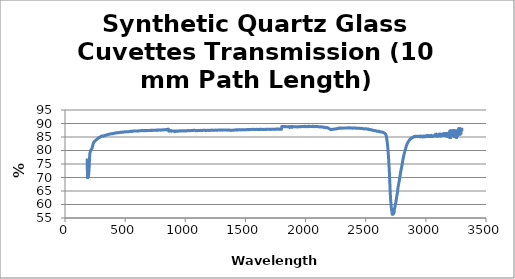
| Category | % Transmission |
|---|---|
| 184.0 | 77.01 |
| 186.0 | 72.795 |
| 188.0 | 69.584 |
| 190.0 | 70.28 |
| 192.0 | 70.039 |
| 194.0 | 70.346 |
| 196.0 | 70.833 |
| 198.0 | 71.847 |
| 200.0 | 72.99 |
| 202.0 | 75.142 |
| 204.0 | 77.218 |
| 206.0 | 78.444 |
| 208.0 | 79.222 |
| 210.0 | 79.507 |
| 212.0 | 79.833 |
| 214.0 | 80.123 |
| 216.0 | 80.232 |
| 218.0 | 80.391 |
| 220.0 | 80.437 |
| 222.0 | 80.59 |
| 224.0 | 80.714 |
| 226.0 | 81.015 |
| 228.0 | 81.384 |
| 230.0 | 81.783 |
| 232.0 | 82.081 |
| 234.0 | 82.448 |
| 236.0 | 82.708 |
| 238.0 | 82.932 |
| 240.0 | 83.122 |
| 242.0 | 83.207 |
| 244.0 | 83.247 |
| 246.0 | 83.444 |
| 248.0 | 83.463 |
| 250.0 | 83.513 |
| 252.0 | 83.63 |
| 254.0 | 83.703 |
| 256.0 | 83.775 |
| 258.0 | 83.917 |
| 260.0 | 83.956 |
| 262.0 | 84.018 |
| 264.0 | 84.085 |
| 266.0 | 84.125 |
| 268.0 | 84.292 |
| 270.0 | 84.31 |
| 272.0 | 84.421 |
| 274.0 | 84.506 |
| 276.0 | 84.494 |
| 278.0 | 84.618 |
| 280.0 | 84.727 |
| 282.0 | 84.783 |
| 284.0 | 84.761 |
| 286.0 | 84.79 |
| 288.0 | 84.826 |
| 290.0 | 84.905 |
| 292.0 | 84.96 |
| 294.0 | 85.03 |
| 296.0 | 85.107 |
| 298.0 | 85.185 |
| 300.0 | 85.177 |
| 302.0 | 85.249 |
| 304.0 | 85.359 |
| 306.0 | 85.329 |
| 308.0 | 85.391 |
| 310.0 | 85.413 |
| 312.0 | 85.385 |
| 314.0 | 85.388 |
| 316.0 | 85.379 |
| 318.0 | 85.413 |
| 320.0 | 85.373 |
| 322.0 | 85.417 |
| 324.0 | 85.411 |
| 326.0 | 85.448 |
| 328.0 | 85.521 |
| 330.0 | 85.534 |
| 332.0 | 85.519 |
| 334.0 | 85.555 |
| 336.0 | 85.603 |
| 338.0 | 85.638 |
| 340.0 | 85.689 |
| 342.0 | 85.733 |
| 344.0 | 85.711 |
| 346.0 | 85.727 |
| 348.0 | 85.74 |
| 350.0 | 85.793 |
| 352.0 | 85.847 |
| 354.0 | 85.887 |
| 356.0 | 85.906 |
| 358.0 | 85.941 |
| 360.0 | 85.958 |
| 362.0 | 85.958 |
| 364.0 | 86 |
| 366.0 | 86.009 |
| 368.0 | 86.025 |
| 370.0 | 86.064 |
| 372.0 | 86.105 |
| 374.0 | 86.102 |
| 376.0 | 86.094 |
| 378.0 | 86.125 |
| 380.0 | 86.155 |
| 382.0 | 86.229 |
| 384.0 | 86.197 |
| 386.0 | 86.145 |
| 388.0 | 86.191 |
| 390.0 | 86.193 |
| 392.0 | 86.206 |
| 394.0 | 86.218 |
| 396.0 | 86.262 |
| 398.0 | 86.307 |
| 400.0 | 86.31 |
| 402.0 | 86.312 |
| 404.0 | 86.304 |
| 406.0 | 86.327 |
| 408.0 | 86.346 |
| 410.0 | 86.379 |
| 412.0 | 86.389 |
| 414.0 | 86.456 |
| 416.0 | 86.529 |
| 418.0 | 86.506 |
| 420.0 | 86.477 |
| 422.0 | 86.49 |
| 424.0 | 86.526 |
| 426.0 | 86.516 |
| 428.0 | 86.542 |
| 430.0 | 86.591 |
| 432.0 | 86.604 |
| 434.0 | 86.586 |
| 436.0 | 86.609 |
| 438.0 | 86.629 |
| 440.0 | 86.62 |
| 442.0 | 86.611 |
| 444.0 | 86.591 |
| 446.0 | 86.6 |
| 448.0 | 86.637 |
| 450.0 | 86.652 |
| 452.0 | 86.668 |
| 454.0 | 86.704 |
| 456.0 | 86.706 |
| 458.0 | 86.736 |
| 460.0 | 86.73 |
| 462.0 | 86.724 |
| 464.0 | 86.711 |
| 466.0 | 86.675 |
| 468.0 | 86.709 |
| 470.0 | 86.742 |
| 472.0 | 86.747 |
| 474.0 | 86.792 |
| 476.0 | 86.811 |
| 478.0 | 86.786 |
| 480.0 | 86.781 |
| 482.0 | 86.776 |
| 484.0 | 86.812 |
| 486.0 | 86.878 |
| 488.0 | 86.893 |
| 490.0 | 86.871 |
| 492.0 | 86.892 |
| 494.0 | 86.918 |
| 496.0 | 86.925 |
| 498.0 | 86.934 |
| 500.0 | 86.923 |
| 502.0 | 86.902 |
| 504.0 | 86.887 |
| 506.0 | 86.928 |
| 508.0 | 86.903 |
| 510.0 | 86.904 |
| 512.0 | 86.931 |
| 514.0 | 86.898 |
| 516.0 | 86.936 |
| 518.0 | 86.952 |
| 520.0 | 86.933 |
| 522.0 | 86.957 |
| 524.0 | 86.953 |
| 526.0 | 86.926 |
| 528.0 | 86.948 |
| 530.0 | 86.984 |
| 532.0 | 86.991 |
| 534.0 | 87.01 |
| 536.0 | 87.052 |
| 538.0 | 87.064 |
| 540.0 | 87.053 |
| 542.0 | 87.086 |
| 544.0 | 87.09 |
| 546.0 | 87.088 |
| 548.0 | 87.091 |
| 550.0 | 87.065 |
| 552.0 | 87.043 |
| 554.0 | 87.062 |
| 556.0 | 87.042 |
| 558.0 | 87.073 |
| 560.0 | 87.161 |
| 562.0 | 87.198 |
| 564.0 | 87.179 |
| 566.0 | 87.195 |
| 568.0 | 87.183 |
| 570.0 | 87.171 |
| 572.0 | 87.208 |
| 574.0 | 87.206 |
| 576.0 | 87.223 |
| 578.0 | 87.174 |
| 580.0 | 87.197 |
| 582.0 | 87.231 |
| 584.0 | 87.228 |
| 586.0 | 87.208 |
| 588.0 | 87.24 |
| 590.0 | 87.269 |
| 592.0 | 87.221 |
| 594.0 | 87.202 |
| 596.0 | 87.23 |
| 598.0 | 87.229 |
| 600.0 | 87.23 |
| 602.0 | 87.237 |
| 604.0 | 87.165 |
| 606.0 | 87.185 |
| 608.0 | 87.267 |
| 610.0 | 87.277 |
| 612.0 | 87.254 |
| 614.0 | 87.262 |
| 616.0 | 87.254 |
| 618.0 | 87.299 |
| 620.0 | 87.319 |
| 622.0 | 87.293 |
| 624.0 | 87.316 |
| 626.0 | 87.311 |
| 628.0 | 87.273 |
| 630.0 | 87.274 |
| 632.0 | 87.276 |
| 634.0 | 87.364 |
| 636.0 | 87.39 |
| 638.0 | 87.373 |
| 640.0 | 87.406 |
| 642.0 | 87.419 |
| 644.0 | 87.375 |
| 646.0 | 87.381 |
| 648.0 | 87.372 |
| 650.0 | 87.344 |
| 652.0 | 87.368 |
| 654.0 | 87.335 |
| 656.0 | 87.323 |
| 658.0 | 87.354 |
| 660.0 | 87.405 |
| 662.0 | 87.345 |
| 664.0 | 87.321 |
| 666.0 | 87.306 |
| 668.0 | 87.293 |
| 670.0 | 87.41 |
| 672.0 | 87.415 |
| 674.0 | 87.428 |
| 676.0 | 87.421 |
| 678.0 | 87.386 |
| 680.0 | 87.401 |
| 682.0 | 87.319 |
| 684.0 | 87.397 |
| 686.0 | 87.408 |
| 688.0 | 87.368 |
| 690.0 | 87.369 |
| 692.0 | 87.417 |
| 694.0 | 87.38 |
| 696.0 | 87.402 |
| 698.0 | 87.392 |
| 700.0 | 87.38 |
| 702.0 | 87.423 |
| 704.0 | 87.394 |
| 706.0 | 87.409 |
| 708.0 | 87.47 |
| 710.0 | 87.465 |
| 712.0 | 87.424 |
| 714.0 | 87.503 |
| 716.0 | 87.532 |
| 718.0 | 87.437 |
| 720.0 | 87.475 |
| 722.0 | 87.509 |
| 724.0 | 87.431 |
| 726.0 | 87.447 |
| 728.0 | 87.487 |
| 730.0 | 87.523 |
| 732.0 | 87.459 |
| 734.0 | 87.455 |
| 736.0 | 87.499 |
| 738.0 | 87.486 |
| 740.0 | 87.518 |
| 742.0 | 87.507 |
| 744.0 | 87.454 |
| 746.0 | 87.494 |
| 748.0 | 87.536 |
| 750.0 | 87.521 |
| 752.0 | 87.483 |
| 754.0 | 87.532 |
| 756.0 | 87.436 |
| 758.0 | 87.537 |
| 760.0 | 87.619 |
| 762.0 | 87.586 |
| 764.0 | 87.534 |
| 766.0 | 87.567 |
| 768.0 | 87.486 |
| 770.0 | 87.536 |
| 772.0 | 87.448 |
| 774.0 | 87.485 |
| 776.0 | 87.604 |
| 778.0 | 87.601 |
| 780.0 | 87.66 |
| 782.0 | 87.61 |
| 784.0 | 87.59 |
| 786.0 | 87.573 |
| 788.0 | 87.567 |
| 790.0 | 87.63 |
| 792.0 | 87.626 |
| 794.0 | 87.509 |
| 796.0 | 87.585 |
| 798.0 | 87.619 |
| 800.0 | 87.598 |
| 802.0 | 87.57 |
| 804.0 | 87.61 |
| 806.0 | 87.582 |
| 808.0 | 87.646 |
| 810.0 | 87.651 |
| 812.0 | 87.639 |
| 814.0 | 87.574 |
| 816.0 | 87.586 |
| 818.0 | 87.639 |
| 820.0 | 87.666 |
| 822.0 | 87.663 |
| 824.0 | 87.677 |
| 826.0 | 87.666 |
| 828.0 | 87.698 |
| 830.0 | 87.689 |
| 832.0 | 87.674 |
| 834.0 | 87.736 |
| 836.0 | 87.666 |
| 838.0 | 87.72 |
| 840.0 | 87.707 |
| 842.0 | 87.7 |
| 844.0 | 87.792 |
| 846.0 | 87.618 |
| 848.0 | 87.726 |
| 850.0 | 87.697 |
| 852.0 | 87.865 |
| 854.0 | 87.683 |
| 856.0 | 87.596 |
| 858.0 | 87.719 |
| 860.0 | 87.909 |
| 862.0 | 87.206 |
| 864.0 | 87.171 |
| 866.0 | 87.149 |
| 868.0 | 87.265 |
| 870.0 | 87.324 |
| 872.0 | 87.271 |
| 874.0 | 87.447 |
| 876.0 | 87.326 |
| 878.0 | 87.282 |
| 880.0 | 87.416 |
| 882.0 | 87.345 |
| 884.0 | 87.171 |
| 886.0 | 87.134 |
| 888.0 | 87.275 |
| 890.0 | 87.259 |
| 892.0 | 87.206 |
| 894.0 | 87.214 |
| 896.0 | 87.214 |
| 898.0 | 87.252 |
| 900.0 | 87.187 |
| 902.0 | 87.243 |
| 904.0 | 87.25 |
| 906.0 | 87.129 |
| 908.0 | 87.049 |
| 910.0 | 87.143 |
| 912.0 | 87.129 |
| 914.0 | 87.016 |
| 916.0 | 87.126 |
| 918.0 | 87.217 |
| 920.0 | 87.195 |
| 922.0 | 87.226 |
| 924.0 | 87.255 |
| 926.0 | 87.203 |
| 928.0 | 87.099 |
| 930.0 | 87.208 |
| 932.0 | 87.243 |
| 934.0 | 87.204 |
| 936.0 | 87.146 |
| 938.0 | 87.118 |
| 940.0 | 87.156 |
| 942.0 | 87.188 |
| 944.0 | 87.248 |
| 946.0 | 87.22 |
| 948.0 | 87.21 |
| 950.0 | 87.246 |
| 952.0 | 87.271 |
| 954.0 | 87.309 |
| 956.0 | 87.269 |
| 958.0 | 87.268 |
| 960.0 | 87.28 |
| 962.0 | 87.245 |
| 964.0 | 87.204 |
| 966.0 | 87.203 |
| 968.0 | 87.221 |
| 970.0 | 87.232 |
| 972.0 | 87.291 |
| 974.0 | 87.296 |
| 976.0 | 87.308 |
| 978.0 | 87.317 |
| 980.0 | 87.316 |
| 982.0 | 87.304 |
| 984.0 | 87.263 |
| 986.0 | 87.294 |
| 988.0 | 87.293 |
| 990.0 | 87.226 |
| 992.0 | 87.229 |
| 994.0 | 87.267 |
| 996.0 | 87.284 |
| 998.0 | 87.307 |
| 1000.0 | 87.322 |
| 1002.0 | 87.306 |
| 1004.0 | 87.256 |
| 1006.0 | 87.282 |
| 1008.0 | 87.332 |
| 1010.0 | 87.292 |
| 1012.0 | 87.263 |
| 1014.0 | 87.309 |
| 1016.0 | 87.348 |
| 1018.0 | 87.326 |
| 1020.0 | 87.337 |
| 1022.0 | 87.368 |
| 1024.0 | 87.403 |
| 1026.0 | 87.387 |
| 1028.0 | 87.348 |
| 1030.0 | 87.367 |
| 1032.0 | 87.335 |
| 1034.0 | 87.317 |
| 1036.0 | 87.331 |
| 1038.0 | 87.337 |
| 1040.0 | 87.334 |
| 1042.0 | 87.348 |
| 1044.0 | 87.393 |
| 1046.0 | 87.397 |
| 1048.0 | 87.41 |
| 1050.0 | 87.408 |
| 1052.0 | 87.374 |
| 1054.0 | 87.366 |
| 1056.0 | 87.401 |
| 1058.0 | 87.428 |
| 1060.0 | 87.423 |
| 1062.0 | 87.422 |
| 1064.0 | 87.431 |
| 1066.0 | 87.469 |
| 1068.0 | 87.513 |
| 1070.0 | 87.492 |
| 1072.0 | 87.45 |
| 1074.0 | 87.465 |
| 1076.0 | 87.506 |
| 1078.0 | 87.468 |
| 1080.0 | 87.431 |
| 1082.0 | 87.444 |
| 1084.0 | 87.388 |
| 1086.0 | 87.331 |
| 1088.0 | 87.379 |
| 1090.0 | 87.412 |
| 1092.0 | 87.382 |
| 1094.0 | 87.37 |
| 1096.0 | 87.367 |
| 1098.0 | 87.334 |
| 1100.0 | 87.322 |
| 1102.0 | 87.334 |
| 1104.0 | 87.363 |
| 1106.0 | 87.406 |
| 1108.0 | 87.416 |
| 1110.0 | 87.439 |
| 1112.0 | 87.41 |
| 1114.0 | 87.403 |
| 1116.0 | 87.428 |
| 1118.0 | 87.409 |
| 1120.0 | 87.417 |
| 1122.0 | 87.429 |
| 1124.0 | 87.481 |
| 1126.0 | 87.471 |
| 1128.0 | 87.441 |
| 1130.0 | 87.431 |
| 1132.0 | 87.445 |
| 1134.0 | 87.427 |
| 1136.0 | 87.404 |
| 1138.0 | 87.391 |
| 1140.0 | 87.396 |
| 1142.0 | 87.395 |
| 1144.0 | 87.442 |
| 1146.0 | 87.487 |
| 1148.0 | 87.471 |
| 1150.0 | 87.461 |
| 1152.0 | 87.485 |
| 1154.0 | 87.488 |
| 1156.0 | 87.497 |
| 1158.0 | 87.509 |
| 1160.0 | 87.533 |
| 1162.0 | 87.519 |
| 1164.0 | 87.504 |
| 1166.0 | 87.48 |
| 1168.0 | 87.423 |
| 1170.0 | 87.447 |
| 1172.0 | 87.427 |
| 1174.0 | 87.394 |
| 1176.0 | 87.411 |
| 1178.0 | 87.434 |
| 1180.0 | 87.459 |
| 1182.0 | 87.484 |
| 1184.0 | 87.517 |
| 1186.0 | 87.514 |
| 1188.0 | 87.452 |
| 1190.0 | 87.459 |
| 1192.0 | 87.463 |
| 1194.0 | 87.436 |
| 1196.0 | 87.44 |
| 1198.0 | 87.448 |
| 1200.0 | 87.44 |
| 1202.0 | 87.452 |
| 1204.0 | 87.508 |
| 1206.0 | 87.52 |
| 1208.0 | 87.452 |
| 1210.0 | 87.466 |
| 1212.0 | 87.489 |
| 1214.0 | 87.484 |
| 1216.0 | 87.483 |
| 1218.0 | 87.484 |
| 1220.0 | 87.523 |
| 1222.0 | 87.592 |
| 1224.0 | 87.557 |
| 1226.0 | 87.531 |
| 1228.0 | 87.527 |
| 1230.0 | 87.545 |
| 1232.0 | 87.512 |
| 1234.0 | 87.524 |
| 1236.0 | 87.548 |
| 1238.0 | 87.505 |
| 1240.0 | 87.472 |
| 1242.0 | 87.488 |
| 1244.0 | 87.498 |
| 1246.0 | 87.495 |
| 1248.0 | 87.518 |
| 1250.0 | 87.548 |
| 1252.0 | 87.569 |
| 1254.0 | 87.564 |
| 1256.0 | 87.532 |
| 1258.0 | 87.552 |
| 1260.0 | 87.545 |
| 1262.0 | 87.529 |
| 1264.0 | 87.512 |
| 1266.0 | 87.514 |
| 1268.0 | 87.509 |
| 1270.0 | 87.552 |
| 1272.0 | 87.577 |
| 1274.0 | 87.577 |
| 1276.0 | 87.584 |
| 1278.0 | 87.602 |
| 1280.0 | 87.641 |
| 1282.0 | 87.588 |
| 1284.0 | 87.572 |
| 1286.0 | 87.587 |
| 1288.0 | 87.543 |
| 1290.0 | 87.54 |
| 1292.0 | 87.569 |
| 1294.0 | 87.552 |
| 1296.0 | 87.568 |
| 1298.0 | 87.592 |
| 1300.0 | 87.565 |
| 1302.0 | 87.568 |
| 1304.0 | 87.549 |
| 1306.0 | 87.552 |
| 1308.0 | 87.523 |
| 1310.0 | 87.533 |
| 1312.0 | 87.562 |
| 1314.0 | 87.63 |
| 1316.0 | 87.617 |
| 1318.0 | 87.597 |
| 1320.0 | 87.577 |
| 1322.0 | 87.545 |
| 1324.0 | 87.569 |
| 1326.0 | 87.609 |
| 1328.0 | 87.578 |
| 1330.0 | 87.589 |
| 1332.0 | 87.616 |
| 1334.0 | 87.629 |
| 1336.0 | 87.604 |
| 1338.0 | 87.57 |
| 1340.0 | 87.581 |
| 1342.0 | 87.578 |
| 1344.0 | 87.589 |
| 1346.0 | 87.59 |
| 1348.0 | 87.548 |
| 1350.0 | 87.55 |
| 1352.0 | 87.528 |
| 1354.0 | 87.558 |
| 1356.0 | 87.575 |
| 1358.0 | 87.627 |
| 1360.0 | 87.611 |
| 1362.0 | 87.585 |
| 1364.0 | 87.581 |
| 1366.0 | 87.521 |
| 1368.0 | 87.543 |
| 1370.0 | 87.556 |
| 1372.0 | 87.513 |
| 1374.0 | 87.498 |
| 1376.0 | 87.461 |
| 1378.0 | 87.474 |
| 1380.0 | 87.445 |
| 1382.0 | 87.448 |
| 1384.0 | 87.499 |
| 1386.0 | 87.457 |
| 1388.0 | 87.465 |
| 1390.0 | 87.466 |
| 1392.0 | 87.462 |
| 1394.0 | 87.472 |
| 1396.0 | 87.503 |
| 1398.0 | 87.515 |
| 1400.0 | 87.549 |
| 1402.0 | 87.515 |
| 1404.0 | 87.548 |
| 1406.0 | 87.544 |
| 1408.0 | 87.568 |
| 1410.0 | 87.572 |
| 1412.0 | 87.587 |
| 1414.0 | 87.591 |
| 1416.0 | 87.578 |
| 1418.0 | 87.567 |
| 1420.0 | 87.592 |
| 1422.0 | 87.646 |
| 1424.0 | 87.671 |
| 1426.0 | 87.619 |
| 1428.0 | 87.621 |
| 1430.0 | 87.642 |
| 1432.0 | 87.642 |
| 1434.0 | 87.629 |
| 1436.0 | 87.647 |
| 1438.0 | 87.628 |
| 1440.0 | 87.635 |
| 1442.0 | 87.634 |
| 1444.0 | 87.672 |
| 1446.0 | 87.685 |
| 1448.0 | 87.736 |
| 1450.0 | 87.735 |
| 1452.0 | 87.679 |
| 1454.0 | 87.686 |
| 1456.0 | 87.708 |
| 1458.0 | 87.648 |
| 1460.0 | 87.614 |
| 1462.0 | 87.615 |
| 1464.0 | 87.652 |
| 1466.0 | 87.652 |
| 1468.0 | 87.665 |
| 1470.0 | 87.684 |
| 1472.0 | 87.676 |
| 1474.0 | 87.688 |
| 1476.0 | 87.682 |
| 1478.0 | 87.682 |
| 1480.0 | 87.685 |
| 1482.0 | 87.664 |
| 1484.0 | 87.65 |
| 1486.0 | 87.679 |
| 1488.0 | 87.678 |
| 1490.0 | 87.677 |
| 1492.0 | 87.717 |
| 1494.0 | 87.666 |
| 1496.0 | 87.678 |
| 1498.0 | 87.675 |
| 1500.0 | 87.659 |
| 1502.0 | 87.722 |
| 1504.0 | 87.718 |
| 1506.0 | 87.687 |
| 1508.0 | 87.698 |
| 1510.0 | 87.734 |
| 1512.0 | 87.749 |
| 1514.0 | 87.74 |
| 1516.0 | 87.734 |
| 1518.0 | 87.76 |
| 1520.0 | 87.795 |
| 1522.0 | 87.785 |
| 1524.0 | 87.695 |
| 1526.0 | 87.688 |
| 1528.0 | 87.745 |
| 1530.0 | 87.786 |
| 1532.0 | 87.748 |
| 1534.0 | 87.747 |
| 1536.0 | 87.798 |
| 1538.0 | 87.812 |
| 1540.0 | 87.826 |
| 1542.0 | 87.774 |
| 1544.0 | 87.796 |
| 1546.0 | 87.765 |
| 1548.0 | 87.822 |
| 1550.0 | 87.787 |
| 1552.0 | 87.815 |
| 1554.0 | 87.812 |
| 1556.0 | 87.792 |
| 1558.0 | 87.836 |
| 1560.0 | 87.857 |
| 1562.0 | 87.909 |
| 1564.0 | 87.879 |
| 1566.0 | 87.824 |
| 1568.0 | 87.813 |
| 1570.0 | 87.774 |
| 1572.0 | 87.819 |
| 1574.0 | 87.778 |
| 1576.0 | 87.776 |
| 1578.0 | 87.812 |
| 1580.0 | 87.779 |
| 1582.0 | 87.782 |
| 1584.0 | 87.776 |
| 1586.0 | 87.825 |
| 1588.0 | 87.837 |
| 1590.0 | 87.839 |
| 1592.0 | 87.872 |
| 1594.0 | 87.848 |
| 1596.0 | 87.801 |
| 1598.0 | 87.839 |
| 1600.0 | 87.816 |
| 1602.0 | 87.798 |
| 1604.0 | 87.755 |
| 1606.0 | 87.82 |
| 1608.0 | 87.784 |
| 1610.0 | 87.753 |
| 1612.0 | 87.788 |
| 1614.0 | 87.828 |
| 1616.0 | 87.839 |
| 1618.0 | 87.799 |
| 1620.0 | 87.777 |
| 1622.0 | 87.833 |
| 1624.0 | 87.799 |
| 1626.0 | 87.857 |
| 1628.0 | 87.846 |
| 1630.0 | 87.826 |
| 1632.0 | 87.8 |
| 1634.0 | 87.83 |
| 1636.0 | 87.86 |
| 1638.0 | 87.848 |
| 1640.0 | 87.84 |
| 1642.0 | 87.806 |
| 1644.0 | 87.811 |
| 1646.0 | 87.806 |
| 1648.0 | 87.787 |
| 1650.0 | 87.836 |
| 1652.0 | 87.791 |
| 1654.0 | 87.783 |
| 1656.0 | 87.798 |
| 1658.0 | 87.822 |
| 1660.0 | 87.814 |
| 1662.0 | 87.836 |
| 1664.0 | 87.782 |
| 1666.0 | 87.848 |
| 1668.0 | 87.889 |
| 1670.0 | 87.871 |
| 1672.0 | 87.887 |
| 1674.0 | 87.861 |
| 1676.0 | 87.806 |
| 1678.0 | 87.822 |
| 1680.0 | 87.849 |
| 1682.0 | 87.828 |
| 1684.0 | 87.865 |
| 1686.0 | 87.824 |
| 1688.0 | 87.864 |
| 1690.0 | 87.843 |
| 1692.0 | 87.842 |
| 1694.0 | 87.872 |
| 1696.0 | 87.871 |
| 1698.0 | 87.867 |
| 1700.0 | 87.823 |
| 1702.0 | 87.884 |
| 1704.0 | 87.784 |
| 1706.0 | 87.842 |
| 1708.0 | 87.893 |
| 1710.0 | 87.892 |
| 1712.0 | 87.831 |
| 1714.0 | 87.811 |
| 1716.0 | 87.876 |
| 1718.0 | 87.834 |
| 1720.0 | 87.833 |
| 1722.0 | 87.884 |
| 1724.0 | 87.862 |
| 1726.0 | 87.873 |
| 1728.0 | 87.842 |
| 1730.0 | 87.914 |
| 1732.0 | 87.903 |
| 1734.0 | 87.866 |
| 1736.0 | 87.88 |
| 1738.0 | 87.825 |
| 1740.0 | 87.844 |
| 1742.0 | 87.804 |
| 1744.0 | 87.844 |
| 1746.0 | 87.839 |
| 1748.0 | 87.862 |
| 1750.0 | 87.892 |
| 1752.0 | 87.908 |
| 1754.0 | 87.965 |
| 1756.0 | 87.923 |
| 1758.0 | 87.848 |
| 1760.0 | 87.966 |
| 1762.0 | 87.877 |
| 1764.0 | 88.006 |
| 1766.0 | 87.983 |
| 1768.0 | 87.954 |
| 1770.0 | 87.955 |
| 1772.0 | 87.949 |
| 1774.0 | 87.894 |
| 1776.0 | 87.885 |
| 1778.0 | 87.899 |
| 1780.0 | 87.883 |
| 1782.0 | 87.891 |
| 1784.0 | 87.958 |
| 1786.0 | 87.886 |
| 1788.0 | 87.873 |
| 1790.0 | 87.887 |
| 1792.0 | 87.924 |
| 1794.0 | 87.907 |
| 1796.0 | 87.893 |
| 1798.0 | 87.876 |
| 1800.0 | 87.905 |
| 1802.0 | 88.862 |
| 1804.0 | 88.839 |
| 1806.0 | 88.891 |
| 1808.0 | 88.875 |
| 1810.0 | 88.871 |
| 1812.0 | 88.907 |
| 1814.0 | 88.886 |
| 1816.0 | 88.897 |
| 1818.0 | 88.906 |
| 1820.0 | 88.797 |
| 1822.0 | 88.785 |
| 1824.0 | 88.81 |
| 1826.0 | 88.833 |
| 1828.0 | 88.817 |
| 1830.0 | 88.864 |
| 1832.0 | 88.854 |
| 1834.0 | 88.866 |
| 1836.0 | 88.854 |
| 1838.0 | 88.813 |
| 1840.0 | 88.793 |
| 1842.0 | 88.835 |
| 1844.0 | 88.823 |
| 1846.0 | 88.766 |
| 1848.0 | 88.798 |
| 1850.0 | 88.802 |
| 1852.0 | 88.811 |
| 1854.0 | 88.797 |
| 1856.0 | 88.752 |
| 1858.0 | 88.8 |
| 1860.0 | 88.856 |
| 1862.0 | 88.874 |
| 1864.0 | 88.818 |
| 1866.0 | 88.755 |
| 1868.0 | 88.535 |
| 1870.0 | 88.549 |
| 1872.0 | 88.717 |
| 1874.0 | 88.793 |
| 1876.0 | 88.812 |
| 1878.0 | 88.783 |
| 1880.0 | 88.819 |
| 1882.0 | 88.926 |
| 1884.0 | 88.836 |
| 1886.0 | 88.58 |
| 1888.0 | 88.682 |
| 1890.0 | 88.608 |
| 1892.0 | 88.851 |
| 1894.0 | 88.868 |
| 1896.0 | 88.814 |
| 1898.0 | 88.803 |
| 1900.0 | 88.788 |
| 1902.0 | 88.791 |
| 1904.0 | 88.811 |
| 1906.0 | 88.756 |
| 1908.0 | 88.8 |
| 1910.0 | 88.788 |
| 1912.0 | 88.769 |
| 1914.0 | 88.801 |
| 1916.0 | 88.839 |
| 1918.0 | 88.815 |
| 1920.0 | 88.782 |
| 1922.0 | 88.736 |
| 1924.0 | 88.773 |
| 1926.0 | 88.833 |
| 1928.0 | 88.791 |
| 1930.0 | 88.742 |
| 1932.0 | 88.758 |
| 1934.0 | 88.772 |
| 1936.0 | 88.75 |
| 1938.0 | 88.736 |
| 1940.0 | 88.748 |
| 1942.0 | 88.815 |
| 1944.0 | 88.783 |
| 1946.0 | 88.813 |
| 1948.0 | 88.839 |
| 1950.0 | 88.875 |
| 1952.0 | 88.851 |
| 1954.0 | 88.882 |
| 1956.0 | 88.828 |
| 1958.0 | 88.83 |
| 1960.0 | 88.837 |
| 1962.0 | 88.811 |
| 1964.0 | 88.842 |
| 1966.0 | 88.857 |
| 1968.0 | 88.849 |
| 1970.0 | 88.853 |
| 1972.0 | 88.869 |
| 1974.0 | 88.852 |
| 1976.0 | 88.87 |
| 1978.0 | 88.871 |
| 1980.0 | 88.881 |
| 1982.0 | 88.884 |
| 1984.0 | 88.912 |
| 1986.0 | 88.866 |
| 1988.0 | 88.809 |
| 1990.0 | 88.897 |
| 1992.0 | 88.949 |
| 1994.0 | 88.963 |
| 1996.0 | 88.984 |
| 1998.0 | 88.878 |
| 2000.0 | 88.908 |
| 2002.0 | 88.866 |
| 2004.0 | 88.88 |
| 2006.0 | 88.819 |
| 2008.0 | 88.825 |
| 2010.0 | 88.843 |
| 2012.0 | 88.85 |
| 2014.0 | 88.873 |
| 2016.0 | 88.869 |
| 2018.0 | 88.873 |
| 2020.0 | 88.905 |
| 2022.0 | 89.025 |
| 2024.0 | 88.931 |
| 2026.0 | 88.891 |
| 2028.0 | 88.804 |
| 2030.0 | 88.931 |
| 2032.0 | 89.004 |
| 2034.0 | 88.867 |
| 2036.0 | 88.895 |
| 2038.0 | 88.868 |
| 2040.0 | 88.877 |
| 2042.0 | 88.903 |
| 2044.0 | 88.879 |
| 2046.0 | 88.875 |
| 2048.0 | 88.937 |
| 2050.0 | 88.905 |
| 2052.0 | 88.885 |
| 2054.0 | 88.889 |
| 2056.0 | 88.923 |
| 2058.0 | 88.957 |
| 2060.0 | 89.032 |
| 2062.0 | 88.856 |
| 2064.0 | 88.86 |
| 2066.0 | 88.857 |
| 2068.0 | 88.906 |
| 2070.0 | 88.865 |
| 2072.0 | 88.823 |
| 2074.0 | 88.832 |
| 2076.0 | 88.816 |
| 2078.0 | 88.818 |
| 2080.0 | 88.908 |
| 2082.0 | 88.916 |
| 2084.0 | 88.897 |
| 2086.0 | 88.934 |
| 2088.0 | 88.897 |
| 2090.0 | 88.864 |
| 2092.0 | 88.846 |
| 2094.0 | 88.855 |
| 2096.0 | 88.874 |
| 2098.0 | 88.835 |
| 2100.0 | 88.833 |
| 2102.0 | 88.841 |
| 2104.0 | 88.864 |
| 2106.0 | 88.823 |
| 2108.0 | 88.816 |
| 2110.0 | 88.816 |
| 2112.0 | 88.825 |
| 2114.0 | 88.778 |
| 2116.0 | 88.735 |
| 2118.0 | 88.74 |
| 2120.0 | 88.716 |
| 2122.0 | 88.726 |
| 2124.0 | 88.766 |
| 2126.0 | 88.769 |
| 2128.0 | 88.757 |
| 2130.0 | 88.78 |
| 2132.0 | 88.745 |
| 2134.0 | 88.713 |
| 2136.0 | 88.704 |
| 2138.0 | 88.744 |
| 2140.0 | 88.736 |
| 2142.0 | 88.738 |
| 2144.0 | 88.65 |
| 2146.0 | 88.649 |
| 2148.0 | 88.63 |
| 2150.0 | 88.54 |
| 2152.0 | 88.585 |
| 2154.0 | 88.615 |
| 2156.0 | 88.577 |
| 2158.0 | 88.589 |
| 2160.0 | 88.557 |
| 2162.0 | 88.511 |
| 2164.0 | 88.492 |
| 2166.0 | 88.469 |
| 2168.0 | 88.456 |
| 2170.0 | 88.445 |
| 2172.0 | 88.437 |
| 2174.0 | 88.473 |
| 2176.0 | 88.487 |
| 2178.0 | 88.472 |
| 2180.0 | 88.434 |
| 2182.0 | 88.407 |
| 2184.0 | 88.4 |
| 2186.0 | 88.35 |
| 2188.0 | 88.307 |
| 2190.0 | 88.257 |
| 2192.0 | 88.181 |
| 2194.0 | 88.125 |
| 2196.0 | 88.078 |
| 2198.0 | 88.042 |
| 2200.0 | 87.962 |
| 2202.0 | 87.883 |
| 2204.0 | 87.867 |
| 2206.0 | 87.823 |
| 2208.0 | 87.8 |
| 2210.0 | 87.762 |
| 2212.0 | 87.745 |
| 2214.0 | 87.709 |
| 2216.0 | 87.734 |
| 2218.0 | 87.749 |
| 2220.0 | 87.807 |
| 2222.0 | 87.862 |
| 2224.0 | 87.864 |
| 2226.0 | 87.853 |
| 2228.0 | 87.853 |
| 2230.0 | 87.851 |
| 2232.0 | 87.857 |
| 2234.0 | 87.922 |
| 2236.0 | 87.947 |
| 2238.0 | 87.971 |
| 2240.0 | 87.943 |
| 2242.0 | 87.945 |
| 2244.0 | 87.948 |
| 2246.0 | 87.956 |
| 2248.0 | 87.96 |
| 2250.0 | 88.002 |
| 2252.0 | 88.027 |
| 2254.0 | 87.996 |
| 2256.0 | 88.001 |
| 2258.0 | 88.033 |
| 2260.0 | 88.069 |
| 2262.0 | 88.103 |
| 2264.0 | 88.125 |
| 2266.0 | 88.153 |
| 2268.0 | 88.154 |
| 2270.0 | 88.14 |
| 2272.0 | 88.156 |
| 2274.0 | 88.18 |
| 2276.0 | 88.251 |
| 2278.0 | 88.302 |
| 2280.0 | 88.344 |
| 2282.0 | 88.356 |
| 2284.0 | 88.299 |
| 2286.0 | 88.243 |
| 2288.0 | 88.193 |
| 2290.0 | 88.207 |
| 2292.0 | 88.251 |
| 2294.0 | 88.319 |
| 2296.0 | 88.313 |
| 2298.0 | 88.299 |
| 2300.0 | 88.301 |
| 2302.0 | 88.31 |
| 2304.0 | 88.286 |
| 2306.0 | 88.24 |
| 2308.0 | 88.236 |
| 2310.0 | 88.291 |
| 2312.0 | 88.293 |
| 2314.0 | 88.307 |
| 2316.0 | 88.321 |
| 2318.0 | 88.312 |
| 2320.0 | 88.304 |
| 2322.0 | 88.306 |
| 2324.0 | 88.296 |
| 2326.0 | 88.294 |
| 2328.0 | 88.314 |
| 2330.0 | 88.311 |
| 2332.0 | 88.327 |
| 2334.0 | 88.359 |
| 2336.0 | 88.35 |
| 2338.0 | 88.36 |
| 2340.0 | 88.356 |
| 2342.0 | 88.355 |
| 2344.0 | 88.37 |
| 2346.0 | 88.334 |
| 2348.0 | 88.322 |
| 2350.0 | 88.369 |
| 2352.0 | 88.392 |
| 2354.0 | 88.375 |
| 2356.0 | 88.386 |
| 2358.0 | 88.386 |
| 2360.0 | 88.386 |
| 2362.0 | 88.376 |
| 2364.0 | 88.356 |
| 2366.0 | 88.312 |
| 2368.0 | 88.335 |
| 2370.0 | 88.377 |
| 2372.0 | 88.363 |
| 2374.0 | 88.385 |
| 2376.0 | 88.38 |
| 2378.0 | 88.342 |
| 2380.0 | 88.342 |
| 2382.0 | 88.323 |
| 2384.0 | 88.321 |
| 2386.0 | 88.296 |
| 2388.0 | 88.292 |
| 2390.0 | 88.266 |
| 2392.0 | 88.29 |
| 2394.0 | 88.34 |
| 2396.0 | 88.298 |
| 2398.0 | 88.311 |
| 2400.0 | 88.353 |
| 2402.0 | 88.334 |
| 2404.0 | 88.298 |
| 2406.0 | 88.306 |
| 2408.0 | 88.284 |
| 2410.0 | 88.277 |
| 2412.0 | 88.297 |
| 2414.0 | 88.316 |
| 2416.0 | 88.314 |
| 2418.0 | 88.258 |
| 2420.0 | 88.275 |
| 2422.0 | 88.293 |
| 2424.0 | 88.236 |
| 2426.0 | 88.205 |
| 2428.0 | 88.221 |
| 2430.0 | 88.268 |
| 2432.0 | 88.245 |
| 2434.0 | 88.257 |
| 2436.0 | 88.288 |
| 2438.0 | 88.275 |
| 2440.0 | 88.247 |
| 2442.0 | 88.211 |
| 2444.0 | 88.218 |
| 2446.0 | 88.226 |
| 2448.0 | 88.2 |
| 2450.0 | 88.197 |
| 2452.0 | 88.188 |
| 2454.0 | 88.173 |
| 2456.0 | 88.19 |
| 2458.0 | 88.228 |
| 2460.0 | 88.22 |
| 2462.0 | 88.189 |
| 2464.0 | 88.192 |
| 2466.0 | 88.166 |
| 2468.0 | 88.117 |
| 2470.0 | 88.113 |
| 2472.0 | 88.117 |
| 2474.0 | 88.108 |
| 2476.0 | 88.105 |
| 2478.0 | 88.1 |
| 2480.0 | 88.069 |
| 2482.0 | 88.04 |
| 2484.0 | 88.078 |
| 2486.0 | 88.096 |
| 2488.0 | 88.057 |
| 2490.0 | 88.02 |
| 2492.0 | 87.988 |
| 2494.0 | 88.015 |
| 2496.0 | 88.06 |
| 2498.0 | 88.05 |
| 2500.0 | 88.033 |
| 2502.0 | 88.028 |
| 2504.0 | 88.049 |
| 2506.0 | 88.024 |
| 2508.0 | 87.975 |
| 2510.0 | 87.976 |
| 2512.0 | 87.976 |
| 2514.0 | 87.937 |
| 2516.0 | 87.885 |
| 2518.0 | 87.931 |
| 2520.0 | 88.012 |
| 2522.0 | 87.967 |
| 2524.0 | 87.853 |
| 2526.0 | 87.787 |
| 2528.0 | 87.775 |
| 2530.0 | 87.797 |
| 2532.0 | 87.819 |
| 2534.0 | 87.782 |
| 2536.0 | 87.775 |
| 2538.0 | 87.761 |
| 2540.0 | 87.75 |
| 2542.0 | 87.726 |
| 2544.0 | 87.637 |
| 2546.0 | 87.596 |
| 2548.0 | 87.58 |
| 2550.0 | 87.555 |
| 2552.0 | 87.54 |
| 2554.0 | 87.58 |
| 2556.0 | 87.595 |
| 2558.0 | 87.51 |
| 2560.0 | 87.452 |
| 2562.0 | 87.447 |
| 2564.0 | 87.449 |
| 2566.0 | 87.397 |
| 2568.0 | 87.379 |
| 2570.0 | 87.368 |
| 2572.0 | 87.297 |
| 2574.0 | 87.307 |
| 2576.0 | 87.33 |
| 2578.0 | 87.341 |
| 2580.0 | 87.371 |
| 2582.0 | 87.339 |
| 2584.0 | 87.29 |
| 2586.0 | 87.254 |
| 2588.0 | 87.24 |
| 2590.0 | 87.194 |
| 2592.0 | 87.107 |
| 2594.0 | 87.082 |
| 2596.0 | 87.135 |
| 2598.0 | 87.146 |
| 2600.0 | 87.085 |
| 2602.0 | 87.114 |
| 2604.0 | 87.086 |
| 2606.0 | 87.058 |
| 2608.0 | 87.127 |
| 2610.0 | 87.115 |
| 2612.0 | 87.039 |
| 2614.0 | 86.921 |
| 2616.0 | 86.904 |
| 2618.0 | 86.967 |
| 2620.0 | 86.92 |
| 2622.0 | 86.942 |
| 2624.0 | 86.93 |
| 2626.0 | 86.913 |
| 2628.0 | 86.858 |
| 2630.0 | 86.862 |
| 2632.0 | 86.896 |
| 2634.0 | 86.83 |
| 2636.0 | 86.8 |
| 2638.0 | 86.782 |
| 2640.0 | 86.749 |
| 2642.0 | 86.732 |
| 2644.0 | 86.741 |
| 2646.0 | 86.716 |
| 2648.0 | 86.636 |
| 2650.0 | 86.594 |
| 2652.0 | 86.565 |
| 2654.0 | 86.503 |
| 2656.0 | 86.431 |
| 2658.0 | 86.351 |
| 2660.0 | 86.334 |
| 2662.0 | 86.218 |
| 2664.0 | 86.14 |
| 2666.0 | 86.043 |
| 2668.0 | 85.762 |
| 2670.0 | 85.46 |
| 2672.0 | 85.132 |
| 2674.0 | 84.546 |
| 2676.0 | 83.963 |
| 2678.0 | 83.38 |
| 2680.0 | 82.628 |
| 2682.0 | 81.77 |
| 2684.0 | 80.774 |
| 2686.0 | 79.715 |
| 2688.0 | 78.557 |
| 2690.0 | 77.268 |
| 2692.0 | 75.834 |
| 2694.0 | 74.289 |
| 2696.0 | 72.585 |
| 2698.0 | 70.528 |
| 2700.0 | 68.404 |
| 2702.0 | 66.394 |
| 2704.0 | 64.363 |
| 2706.0 | 62.644 |
| 2708.0 | 61.411 |
| 2710.0 | 60.353 |
| 2712.0 | 59.199 |
| 2714.0 | 58.444 |
| 2716.0 | 57.428 |
| 2718.0 | 57.441 |
| 2720.0 | 56.587 |
| 2722.0 | 56.357 |
| 2724.0 | 56.967 |
| 2726.0 | 56.503 |
| 2728.0 | 56.535 |
| 2730.0 | 56.461 |
| 2732.0 | 56.925 |
| 2734.0 | 56.894 |
| 2736.0 | 57.156 |
| 2738.0 | 58.211 |
| 2740.0 | 58.494 |
| 2742.0 | 58.788 |
| 2744.0 | 59.533 |
| 2746.0 | 60.025 |
| 2748.0 | 60.369 |
| 2750.0 | 60.468 |
| 2752.0 | 61.432 |
| 2754.0 | 61.7 |
| 2756.0 | 62.383 |
| 2758.0 | 63.045 |
| 2760.0 | 63.503 |
| 2762.0 | 63.949 |
| 2764.0 | 64.277 |
| 2766.0 | 65.388 |
| 2768.0 | 66.05 |
| 2770.0 | 66.652 |
| 2772.0 | 67.062 |
| 2774.0 | 67.659 |
| 2776.0 | 68.138 |
| 2778.0 | 68.525 |
| 2780.0 | 69.085 |
| 2782.0 | 69.687 |
| 2784.0 | 70.042 |
| 2786.0 | 70.633 |
| 2788.0 | 71.288 |
| 2790.0 | 71.979 |
| 2792.0 | 72.3 |
| 2794.0 | 72.85 |
| 2796.0 | 73.319 |
| 2798.0 | 73.727 |
| 2800.0 | 74.237 |
| 2802.0 | 74.752 |
| 2804.0 | 75.141 |
| 2806.0 | 75.711 |
| 2808.0 | 76.261 |
| 2810.0 | 76.824 |
| 2812.0 | 77.187 |
| 2814.0 | 77.662 |
| 2816.0 | 78.024 |
| 2818.0 | 78.407 |
| 2820.0 | 78.79 |
| 2822.0 | 79.154 |
| 2824.0 | 79.499 |
| 2826.0 | 79.889 |
| 2828.0 | 80.195 |
| 2830.0 | 80.538 |
| 2832.0 | 80.743 |
| 2834.0 | 81.069 |
| 2836.0 | 81.394 |
| 2838.0 | 81.728 |
| 2840.0 | 81.955 |
| 2842.0 | 82.135 |
| 2844.0 | 82.456 |
| 2846.0 | 82.57 |
| 2848.0 | 82.675 |
| 2850.0 | 82.918 |
| 2852.0 | 83.132 |
| 2854.0 | 83.311 |
| 2856.0 | 83.392 |
| 2858.0 | 83.484 |
| 2860.0 | 83.599 |
| 2862.0 | 83.794 |
| 2864.0 | 83.964 |
| 2866.0 | 83.992 |
| 2868.0 | 84.152 |
| 2870.0 | 84.185 |
| 2872.0 | 84.356 |
| 2874.0 | 84.365 |
| 2876.0 | 84.447 |
| 2878.0 | 84.536 |
| 2880.0 | 84.56 |
| 2882.0 | 84.645 |
| 2884.0 | 84.666 |
| 2886.0 | 84.745 |
| 2888.0 | 84.824 |
| 2890.0 | 84.842 |
| 2892.0 | 84.881 |
| 2894.0 | 84.949 |
| 2896.0 | 84.906 |
| 2898.0 | 84.959 |
| 2900.0 | 85.141 |
| 2902.0 | 85.017 |
| 2904.0 | 85.097 |
| 2906.0 | 85.169 |
| 2908.0 | 85.167 |
| 2910.0 | 85.195 |
| 2912.0 | 85.072 |
| 2914.0 | 85.264 |
| 2916.0 | 85.209 |
| 2918.0 | 85.238 |
| 2920.0 | 85.257 |
| 2922.0 | 85.248 |
| 2924.0 | 85.224 |
| 2926.0 | 85.205 |
| 2928.0 | 85.216 |
| 2930.0 | 85.219 |
| 2932.0 | 85.137 |
| 2934.0 | 85.312 |
| 2936.0 | 85.224 |
| 2938.0 | 85.189 |
| 2940.0 | 85.168 |
| 2942.0 | 85.341 |
| 2944.0 | 85.154 |
| 2946.0 | 85.121 |
| 2948.0 | 85.265 |
| 2950.0 | 85.143 |
| 2952.0 | 85.15 |
| 2954.0 | 85.102 |
| 2956.0 | 85.344 |
| 2958.0 | 85.175 |
| 2960.0 | 85.22 |
| 2962.0 | 85.253 |
| 2964.0 | 85.277 |
| 2966.0 | 85.323 |
| 2968.0 | 85.074 |
| 2970.0 | 85.189 |
| 2972.0 | 85.107 |
| 2974.0 | 84.955 |
| 2976.0 | 85.217 |
| 2978.0 | 85.14 |
| 2980.0 | 85.223 |
| 2982.0 | 85.197 |
| 2984.0 | 85.393 |
| 2986.0 | 85.249 |
| 2988.0 | 85.12 |
| 2990.0 | 85.224 |
| 2992.0 | 85.324 |
| 2994.0 | 85.335 |
| 2996.0 | 85.071 |
| 2998.0 | 85.315 |
| 3000.0 | 85.33 |
| 3002.0 | 85.173 |
| 3004.0 | 85.449 |
| 3006.0 | 85.515 |
| 3008.0 | 85.246 |
| 3010.0 | 85.412 |
| 3012.0 | 85.539 |
| 3014.0 | 85.47 |
| 3016.0 | 85.178 |
| 3018.0 | 85.483 |
| 3020.0 | 85.476 |
| 3022.0 | 85.305 |
| 3024.0 | 85.167 |
| 3026.0 | 85.496 |
| 3028.0 | 85.471 |
| 3030.0 | 85.133 |
| 3032.0 | 85.415 |
| 3034.0 | 85.224 |
| 3036.0 | 85.31 |
| 3038.0 | 85.49 |
| 3040.0 | 85.446 |
| 3042.0 | 85.391 |
| 3044.0 | 85.15 |
| 3046.0 | 85.62 |
| 3048.0 | 85.401 |
| 3050.0 | 85.272 |
| 3052.0 | 85.349 |
| 3054.0 | 85.378 |
| 3056.0 | 85.333 |
| 3058.0 | 85.15 |
| 3060.0 | 85.384 |
| 3062.0 | 85.333 |
| 3064.0 | 85.314 |
| 3066.0 | 85.411 |
| 3068.0 | 85.403 |
| 3070.0 | 85.52 |
| 3072.0 | 85.403 |
| 3074.0 | 85.436 |
| 3076.0 | 85.907 |
| 3078.0 | 85.437 |
| 3080.0 | 85.916 |
| 3082.0 | 85.42 |
| 3084.0 | 85.8 |
| 3086.0 | 86.09 |
| 3088.0 | 85.622 |
| 3090.0 | 85.399 |
| 3092.0 | 85.712 |
| 3094.0 | 85.244 |
| 3096.0 | 85.263 |
| 3098.0 | 85.587 |
| 3100.0 | 85.303 |
| 3102.0 | 85.524 |
| 3104.0 | 85.848 |
| 3106.0 | 85.515 |
| 3108.0 | 85.829 |
| 3110.0 | 86.079 |
| 3112.0 | 85.755 |
| 3114.0 | 85.425 |
| 3116.0 | 85.451 |
| 3118.0 | 85.827 |
| 3120.0 | 86.085 |
| 3122.0 | 85.346 |
| 3124.0 | 85.356 |
| 3126.0 | 85.514 |
| 3128.0 | 85.683 |
| 3130.0 | 85.743 |
| 3132.0 | 85.84 |
| 3134.0 | 85.721 |
| 3136.0 | 85.578 |
| 3138.0 | 85.826 |
| 3140.0 | 86.186 |
| 3142.0 | 85.849 |
| 3144.0 | 85.124 |
| 3146.0 | 85.852 |
| 3148.0 | 85.91 |
| 3150.0 | 85.72 |
| 3152.0 | 85.862 |
| 3154.0 | 85.97 |
| 3156.0 | 86.02 |
| 3158.0 | 86.752 |
| 3160.0 | 85.465 |
| 3162.0 | 85.658 |
| 3164.0 | 85.512 |
| 3166.0 | 86.158 |
| 3168.0 | 85.634 |
| 3170.0 | 86.071 |
| 3172.0 | 86.746 |
| 3174.0 | 84.921 |
| 3176.0 | 86.667 |
| 3178.0 | 85.05 |
| 3180.0 | 85.208 |
| 3182.0 | 85.902 |
| 3184.0 | 85.628 |
| 3186.0 | 85.734 |
| 3188.0 | 84.747 |
| 3190.0 | 85.785 |
| 3192.0 | 85.554 |
| 3194.0 | 85.981 |
| 3196.0 | 86.508 |
| 3198.0 | 85.863 |
| 3200.0 | 87.509 |
| 3202.0 | 84.265 |
| 3204.0 | 87.184 |
| 3206.0 | 85.082 |
| 3208.0 | 87.806 |
| 3210.0 | 85.524 |
| 3212.0 | 85.941 |
| 3214.0 | 85.819 |
| 3216.0 | 85.247 |
| 3218.0 | 86.654 |
| 3220.0 | 85.936 |
| 3222.0 | 86.285 |
| 3224.0 | 85.571 |
| 3226.0 | 84.949 |
| 3228.0 | 85.813 |
| 3230.0 | 87.27 |
| 3232.0 | 87.861 |
| 3234.0 | 85.877 |
| 3236.0 | 87.005 |
| 3238.0 | 87.256 |
| 3240.0 | 84.616 |
| 3242.0 | 87.455 |
| 3244.0 | 85.564 |
| 3246.0 | 87.653 |
| 3248.0 | 84.892 |
| 3250.0 | 85.798 |
| 3252.0 | 87.71 |
| 3254.0 | 84.373 |
| 3256.0 | 87.189 |
| 3258.0 | 85.92 |
| 3260.0 | 87.636 |
| 3262.0 | 85.101 |
| 3264.0 | 85.803 |
| 3266.0 | 87.174 |
| 3268.0 | 85.832 |
| 3270.0 | 87.2 |
| 3272.0 | 85.648 |
| 3274.0 | 88.411 |
| 3276.0 | 86.279 |
| 3278.0 | 87.479 |
| 3280.0 | 88.554 |
| 3282.0 | 85.585 |
| 3284.0 | 86.032 |
| 3286.0 | 86.629 |
| 3288.0 | 87.34 |
| 3290.0 | 85.968 |
| 3292.0 | 86.737 |
| 3294.0 | 87.192 |
| 3296.0 | 87.851 |
| 3298.0 | 88.392 |
| 3300.0 | 87.277 |